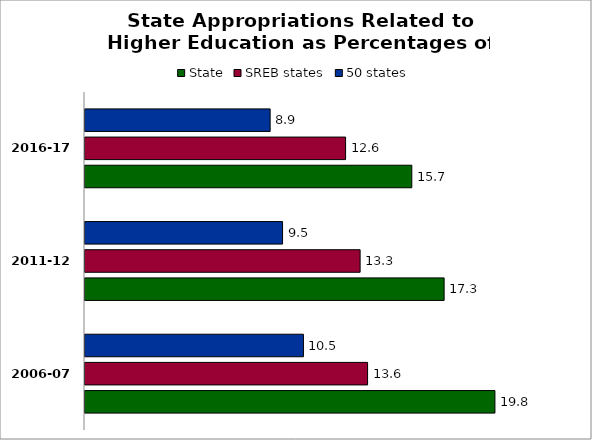
| Category | State | SREB states | 50 states |
|---|---|---|---|
| 2006-07 | 19.755 | 13.618 | 10.527 |
| 2011-12 | 17.307 | 13.258 | 9.521 |
| 2016-17 | 15.749 | 12.558 | 8.923 |